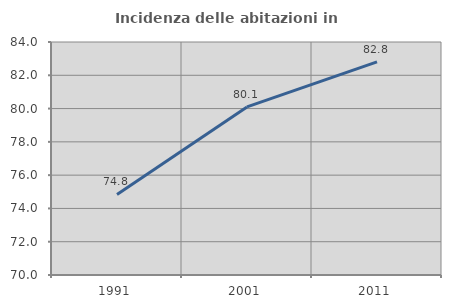
| Category | Incidenza delle abitazioni in proprietà  |
|---|---|
| 1991.0 | 74.838 |
| 2001.0 | 80.099 |
| 2011.0 | 82.808 |